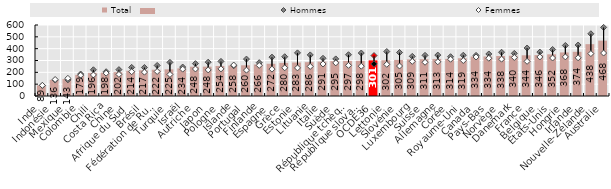
| Category | Total |
|---|---|
| Inde | 89.4 |
| Indonésie | 136.2 |
| Mexique | 142.7 |
| Colombie | 178.8 |
| Chili | 195.5 |
| Costa Rica | 197.7 |
| Chine | 201.7 |
| Afrique du Sud | 213.5 |
| Brésil | 217.2 |
| Fédération de Russie | 222.1 |
| Turquie | 225.1 |
| Israël | 233.5 |
| Autriche | 247.7 |
| Japon | 248 |
| Pologne | 253.8 |
| Islande | 257.8 |
| Portugal | 259.5 |
| Finlande | 266.3 |
| Espagne | 272.3 |
| Grèce | 279.8 |
| Estonie | 283.3 |
| Lituanie | 285.8 |
| Italie | 290.6 |
| Suède | 294.7 |
| République tchèque | 296.7 |
| République slovaque | 297.5 |
| OCDE36 | 301.114 |
| Lettonie | 302.2 |
| Slovénie | 304.9 |
| Luxembourg | 309.3 |
| Suisse | 311 |
| Allemagne | 313.1 |
| Corée | 313.5 |
| Royaume-Uni | 319.2 |
| Canada | 334 |
| Pays-Bas | 334.1 |
| Norvège | 337.8 |
| Danemark | 340.4 |
| France | 344.1 |
| Belgique | 345.8 |
| États-Unis  | 352.2 |
| Hongrie | 368.1 |
| Irlande | 373.7 |
| Nouvelle-Zélande | 438.1 |
| Australie | 468 |